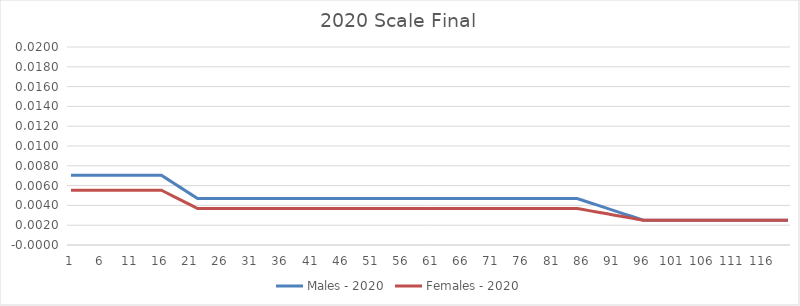
| Category |  Males - 2020  |  Females - 2020  |
|---|---|---|
| 0 | 0.007 | 0.006 |
| 1 | 0.007 | 0.006 |
| 2 | 0.007 | 0.006 |
| 3 | 0.007 | 0.006 |
| 4 | 0.007 | 0.006 |
| 5 | 0.007 | 0.006 |
| 6 | 0.007 | 0.006 |
| 7 | 0.007 | 0.006 |
| 8 | 0.007 | 0.006 |
| 9 | 0.007 | 0.006 |
| 10 | 0.007 | 0.006 |
| 11 | 0.007 | 0.006 |
| 12 | 0.007 | 0.006 |
| 13 | 0.007 | 0.006 |
| 14 | 0.007 | 0.006 |
| 15 | 0.007 | 0.006 |
| 16 | 0.007 | 0.005 |
| 17 | 0.006 | 0.005 |
| 18 | 0.006 | 0.005 |
| 19 | 0.005 | 0.004 |
| 20 | 0.005 | 0.004 |
| 21 | 0.005 | 0.004 |
| 22 | 0.005 | 0.004 |
| 23 | 0.005 | 0.004 |
| 24 | 0.005 | 0.004 |
| 25 | 0.005 | 0.004 |
| 26 | 0.005 | 0.004 |
| 27 | 0.005 | 0.004 |
| 28 | 0.005 | 0.004 |
| 29 | 0.005 | 0.004 |
| 30 | 0.005 | 0.004 |
| 31 | 0.005 | 0.004 |
| 32 | 0.005 | 0.004 |
| 33 | 0.005 | 0.004 |
| 34 | 0.005 | 0.004 |
| 35 | 0.005 | 0.004 |
| 36 | 0.005 | 0.004 |
| 37 | 0.005 | 0.004 |
| 38 | 0.005 | 0.004 |
| 39 | 0.005 | 0.004 |
| 40 | 0.005 | 0.004 |
| 41 | 0.005 | 0.004 |
| 42 | 0.005 | 0.004 |
| 43 | 0.005 | 0.004 |
| 44 | 0.005 | 0.004 |
| 45 | 0.005 | 0.004 |
| 46 | 0.005 | 0.004 |
| 47 | 0.005 | 0.004 |
| 48 | 0.005 | 0.004 |
| 49 | 0.005 | 0.004 |
| 50 | 0.005 | 0.004 |
| 51 | 0.005 | 0.004 |
| 52 | 0.005 | 0.004 |
| 53 | 0.005 | 0.004 |
| 54 | 0.005 | 0.004 |
| 55 | 0.005 | 0.004 |
| 56 | 0.005 | 0.004 |
| 57 | 0.005 | 0.004 |
| 58 | 0.005 | 0.004 |
| 59 | 0.005 | 0.004 |
| 60 | 0.005 | 0.004 |
| 61 | 0.005 | 0.004 |
| 62 | 0.005 | 0.004 |
| 63 | 0.005 | 0.004 |
| 64 | 0.005 | 0.004 |
| 65 | 0.005 | 0.004 |
| 66 | 0.005 | 0.004 |
| 67 | 0.005 | 0.004 |
| 68 | 0.005 | 0.004 |
| 69 | 0.005 | 0.004 |
| 70 | 0.005 | 0.004 |
| 71 | 0.005 | 0.004 |
| 72 | 0.005 | 0.004 |
| 73 | 0.005 | 0.004 |
| 74 | 0.005 | 0.004 |
| 75 | 0.005 | 0.004 |
| 76 | 0.005 | 0.004 |
| 77 | 0.005 | 0.004 |
| 78 | 0.005 | 0.004 |
| 79 | 0.005 | 0.004 |
| 80 | 0.005 | 0.004 |
| 81 | 0.005 | 0.004 |
| 82 | 0.005 | 0.004 |
| 83 | 0.005 | 0.004 |
| 84 | 0.005 | 0.004 |
| 85 | 0.004 | 0.004 |
| 86 | 0.004 | 0.003 |
| 87 | 0.004 | 0.003 |
| 88 | 0.004 | 0.003 |
| 89 | 0.004 | 0.003 |
| 90 | 0.003 | 0.003 |
| 91 | 0.003 | 0.003 |
| 92 | 0.003 | 0.003 |
| 93 | 0.003 | 0.003 |
| 94 | 0.003 | 0.003 |
| 95 | 0.002 | 0.002 |
| 96 | 0.002 | 0.002 |
| 97 | 0.002 | 0.002 |
| 98 | 0.002 | 0.002 |
| 99 | 0.002 | 0.002 |
| 100 | 0.002 | 0.002 |
| 101 | 0.002 | 0.002 |
| 102 | 0.002 | 0.002 |
| 103 | 0.002 | 0.002 |
| 104 | 0.002 | 0.002 |
| 105 | 0.002 | 0.002 |
| 106 | 0.002 | 0.002 |
| 107 | 0.002 | 0.002 |
| 108 | 0.002 | 0.002 |
| 109 | 0.002 | 0.002 |
| 110 | 0.002 | 0.002 |
| 111 | 0.002 | 0.002 |
| 112 | 0.002 | 0.002 |
| 113 | 0.002 | 0.002 |
| 114 | 0.002 | 0.002 |
| 115 | 0.002 | 0.002 |
| 116 | 0.002 | 0.002 |
| 117 | 0.002 | 0.002 |
| 118 | 0.002 | 0.002 |
| 119 | 0.002 | 0.002 |